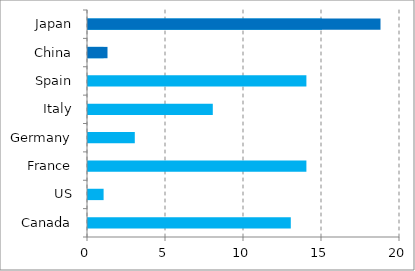
| Category | Value |
|---|---|
| Canada | 13 |
| US | 1 |
| France | 14 |
| Germany | 3 |
| Italy | 8 |
| Spain | 14 |
| China | 1 |
| Japan | 15 |